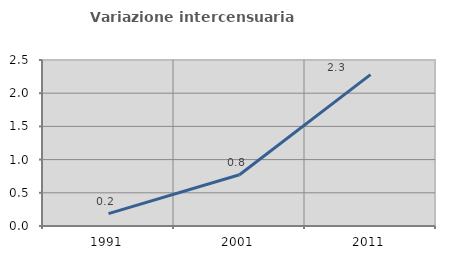
| Category | Variazione intercensuaria annua |
|---|---|
| 1991.0 | 0.187 |
| 2001.0 | 0.771 |
| 2011.0 | 2.281 |